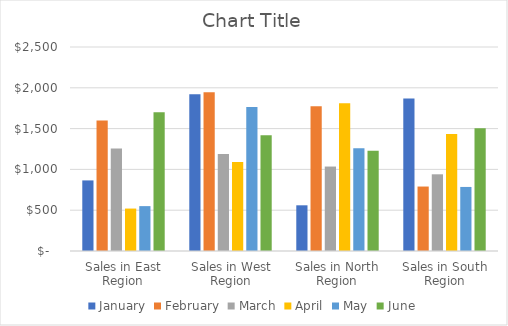
| Category | January | February | March | April | May | June |
|---|---|---|---|---|---|---|
| Sales in East Region | 865 | 1600 | 1255 | 520 | 550 | 1700 |
| Sales in West Region | 1920 | 1945 | 1190 | 1090 | 1765 | 1420 |
| Sales in North Region | 560 | 1775 | 1035 | 1810 | 1260 | 1230 |
| Sales in South Region | 1870 | 790 | 940 | 1435 | 785 | 1505 |